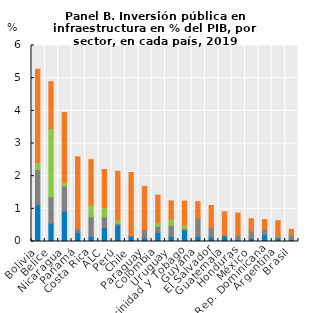
| Category | Agua | Energía | Telecomunicaciones | Transporte |
|---|---|---|---|---|
| Bolivia | 1.123 | 1.081 | 0.214 | 2.855 |
| Belice | 0.547 | 0.82 | 2.095 | 1.432 |
| Nicaragua | 0.928 | 0.769 | 0.124 | 2.125 |
| Panamá | 0.27 | 0.13 | 0 | 2.192 |
| Costa Rica | 0.153 | 0.608 | 0.353 | 1.392 |
| ALC | 0.417 | 0.339 | 0.28 | 1.168 |
| Perú | 0.5 | 0.054 | 0.104 | 1.489 |
| Chile | 0.16 | 0.019 | 0 | 1.932 |
| Paraguay | 0.103 | 0.256 | 0 | 1.329 |
| Colombia | 0.272 | 0.194 | 0.108 | 0.843 |
| Uruguay | 0.147 | 0.341 | 0.207 | 0.549 |
| Trinidad y Tobago | 0.347 | 0.055 | 0.106 | 0.73 |
| Guyana | 0.146 | 0.568 | 0 | 0.506 |
| El Salvador | 0.13 | 0.287 | 0 | 0.685 |
| Guatemala | 0.168 | 0.016 | 0 | 0.725 |
| Honduras | 0.046 | 0.148 | 0 | 0.675 |
| México | 0.093 | 0.231 | 0.003 | 0.368 |
| Rep. Dominicana | 0.211 | 0.174 | 0 | 0.288 |
| Argentina | 0.103 | 0.058 | 0.009 | 0.466 |
| Brasil | 0.058 | 0.145 | 0.003 | 0.165 |